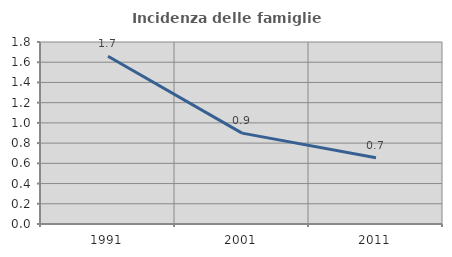
| Category | Incidenza delle famiglie numerose |
|---|---|
| 1991.0 | 1.658 |
| 2001.0 | 0.899 |
| 2011.0 | 0.654 |